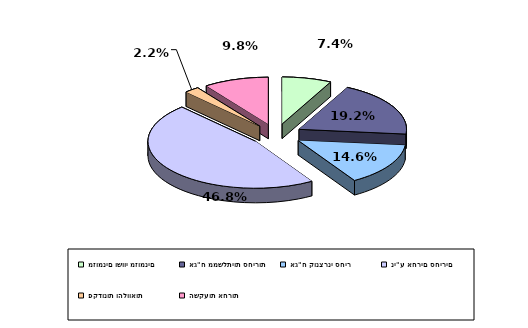
| Category | Series 0 |
|---|---|
| מזומנים ושווי מזומנים | 0.074 |
| אג"ח ממשלתיות סחירות | 0.192 |
| אג"ח קונצרני סחיר | 0.146 |
| ני"ע אחרים סחירים | 0.468 |
| פקדונות והלוואות | 0.022 |
| השקעות אחרות | 0.098 |